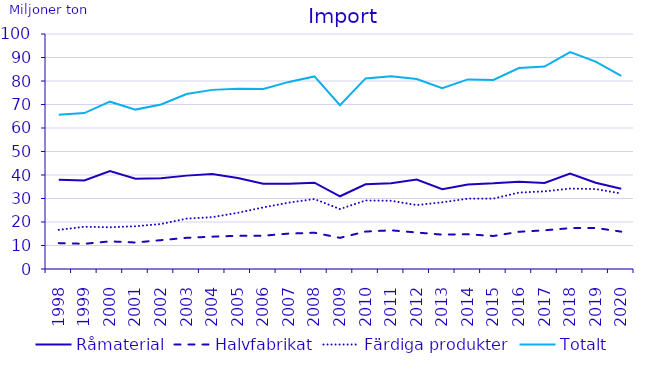
| Category | Råmaterial | Halvfabrikat | Färdiga produkter | Totalt |
|---|---|---|---|---|
| 1998.0 | 37.966 | 11.014 | 16.661 | 65.641 |
| 1999.0 | 37.636 | 10.727 | 17.985 | 66.347 |
| 2000.0 | 41.688 | 11.758 | 17.752 | 71.198 |
| 2001.0 | 38.371 | 11.277 | 18.182 | 67.83 |
| 2002.0 | 38.577 | 12.277 | 19.143 | 69.998 |
| 2003.0 | 39.734 | 13.273 | 21.444 | 74.451 |
| 2004.0 | 40.405 | 13.753 | 22.066 | 76.225 |
| 2005.0 | 38.684 | 14.132 | 23.906 | 76.722 |
| 2006.0 | 36.256 | 14.162 | 26.212 | 76.629 |
| 2007.0 | 36.27 | 15.078 | 28.265 | 79.613 |
| 2008.0 | 36.749 | 15.423 | 29.775 | 81.947 |
| 2009.0 | 30.949 | 13.254 | 25.507 | 69.71 |
| 2010.0 | 36.017 | 15.931 | 29.156 | 81.104 |
| 2011.0 | 36.516 | 16.464 | 29.052 | 82.032 |
| 2012.0 | 38.104 | 15.532 | 27.206 | 80.842 |
| 2013.0 | 33.918 | 14.615 | 28.394 | 76.928 |
| 2014.0 | 35.964 | 14.786 | 29.928 | 80.678 |
| 2015.0 | 36.447 | 14.052 | 29.959 | 80.457 |
| 2016.0 | 37.172 | 15.832 | 32.519 | 85.522 |
| 2017.0 | 36.644 | 16.467 | 33.047 | 86.158 |
| 2018.0 | 40.659 | 17.381 | 34.223 | 92.263 |
| 2019.0 | 36.723 | 17.482 | 34.014 | 88.218 |
| 2020.0 | 34.156 | 15.892 | 32.144 | 82.192 |